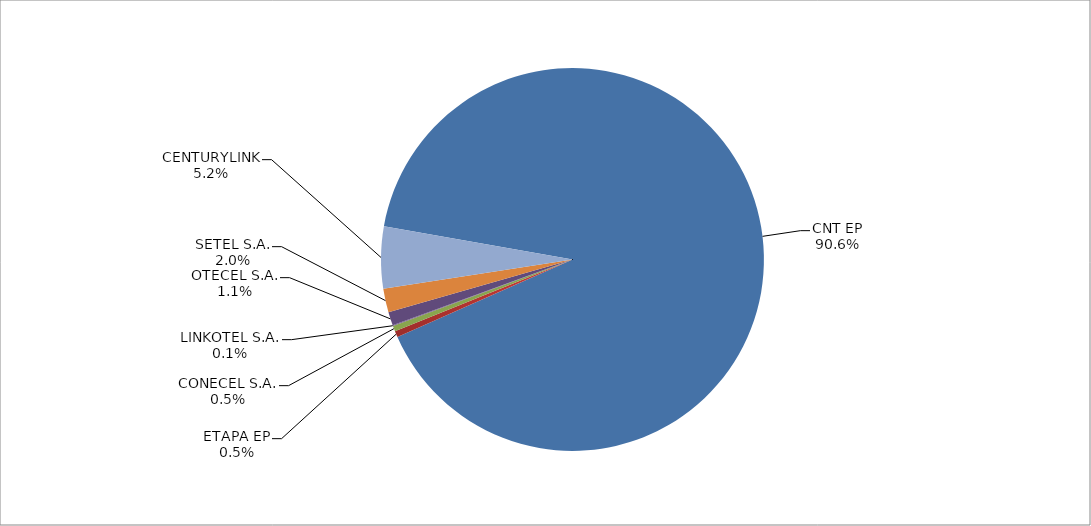
| Category | Series 0 |
|---|---|
| CNT EP | 2934 |
| ETAPA EP | 17 |
| CONECEL S.A. | 15 |
| LINKOTEL S.A. | 2 |
| OTECEL S.A. | 37 |
| SETEL S.A. | 65 |
| CENTURYLINK | 169 |